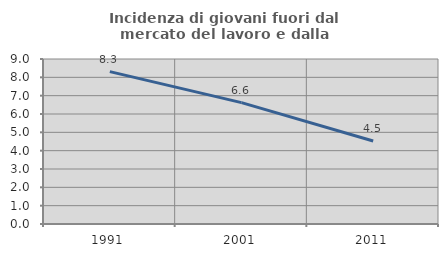
| Category | Incidenza di giovani fuori dal mercato del lavoro e dalla formazione  |
|---|---|
| 1991.0 | 8.314 |
| 2001.0 | 6.62 |
| 2011.0 | 4.528 |